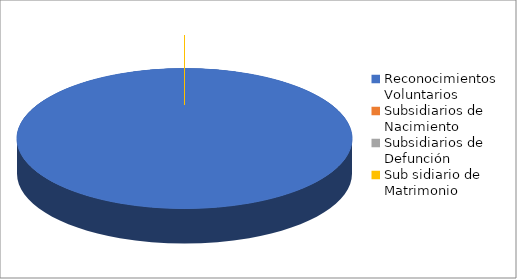
| Category | Series 0 |
|---|---|
| Reconocimientos Voluntarios  | 4 |
| Subsidiarios de Nacimiento | 0 |
| Subsidiarios de Defunción | 0 |
| Sub sidiario de Matrimonio | 0 |